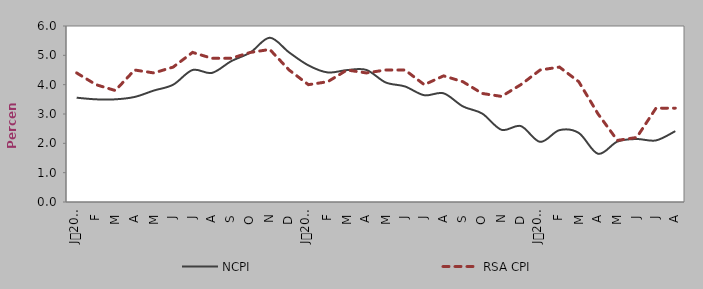
| Category | NCPI | RSA CPI |
|---|---|---|
| 0 | 3.555 | 4.4 |
| 1900-01-01 | 3.5 | 4 |
| 1900-01-02 | 3.5 | 3.8 |
| 1900-01-03 | 3.581 | 4.5 |
| 1900-01-04 | 3.8 | 4.4 |
| 1900-01-05 | 4 | 4.6 |
| 1900-01-06 | 4.5 | 5.1 |
| 1900-01-07 | 4.4 | 4.9 |
| 1900-01-08 | 4.8 | 4.9 |
| 1900-01-09 | 5.1 | 5.1 |
| 1900-01-10 | 5.6 | 5.2 |
| 1900-01-11 | 5.1 | 4.5 |
| 1900-01-12 | 4.658 | 4 |
| 1900-01-13 | 4.416 | 4.1 |
| 1900-01-14 | 4.498 | 4.5 |
| 1900-01-15 | 4.503 | 4.4 |
| 1900-01-16 | 4.076 | 4.5 |
| 1900-01-17 | 3.939 | 4.5 |
| 1900-01-18 | 3.639 | 4 |
| 1900-01-19 | 3.705 | 4.3 |
| 1900-01-20 | 3.259 | 4.1 |
| 1900-01-21 | 3.015 | 3.7 |
| 1900-01-22 | 2.461 | 3.6 |
| 1900-01-23 | 2.588 | 4 |
| 1900-01-24 | 2.05 | 4.5 |
| 1900-01-25 | 2.45 | 4.6 |
| 1900-01-26 | 2.354 | 4.1 |
| 1900-01-27 | 1.643 | 3 |
| 1900-01-28 | 2.06 | 2.1 |
| 1900-01-29 | 2.147 | 2.2 |
| 1900-01-30 | 2.1 | 3.2 |
| 1900-01-31 | 2.416 | 3.2 |